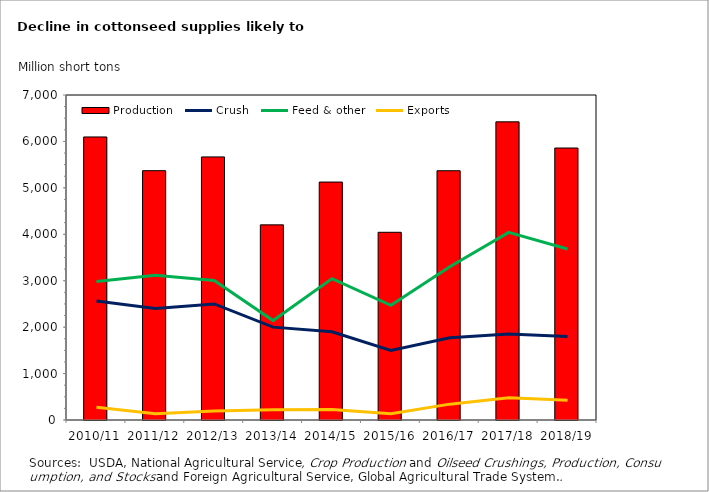
| Category | Production |
|---|---|
| 2010/11 | 6096.1 |
| 2011/12 | 5370 |
| 2012/13 | 5666 |
| 2013/14 | 4203 |
| 2014/15 | 5125 |
| 2015/16 | 4043 |
| 2016/17 | 5369 |
| 2017/18 | 6422 |
| 2018/19 | 5858 |